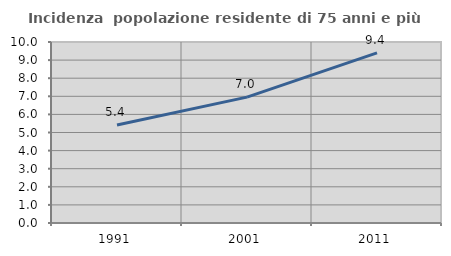
| Category | Incidenza  popolazione residente di 75 anni e più |
|---|---|
| 1991.0 | 5.417 |
| 2001.0 | 6.954 |
| 2011.0 | 9.403 |